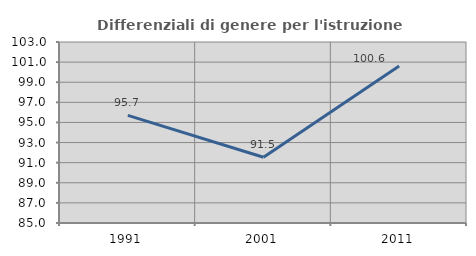
| Category | Differenziali di genere per l'istruzione superiore |
|---|---|
| 1991.0 | 95.7 |
| 2001.0 | 91.533 |
| 2011.0 | 100.619 |